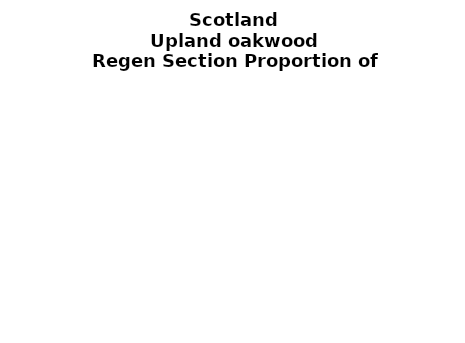
| Category | Upland oakwood |
|---|---|
| None | 0.105 |
| Seedlings only | 0 |
| Seedlings, saplings only | 0.102 |
| Seedlings, saplings, <7 cm trees | 0.114 |
| Saplings only | 0.294 |
| <7 cm trees, seedlings only | 0 |
| <7 cm trees, saplings only | 0.251 |
| <7 cm Trees only | 0.135 |